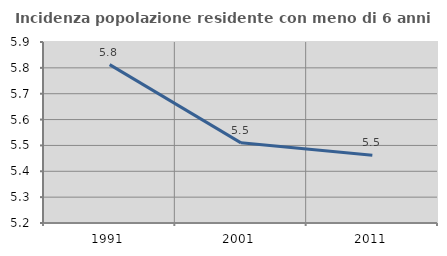
| Category | Incidenza popolazione residente con meno di 6 anni |
|---|---|
| 1991.0 | 5.813 |
| 2001.0 | 5.51 |
| 2011.0 | 5.462 |